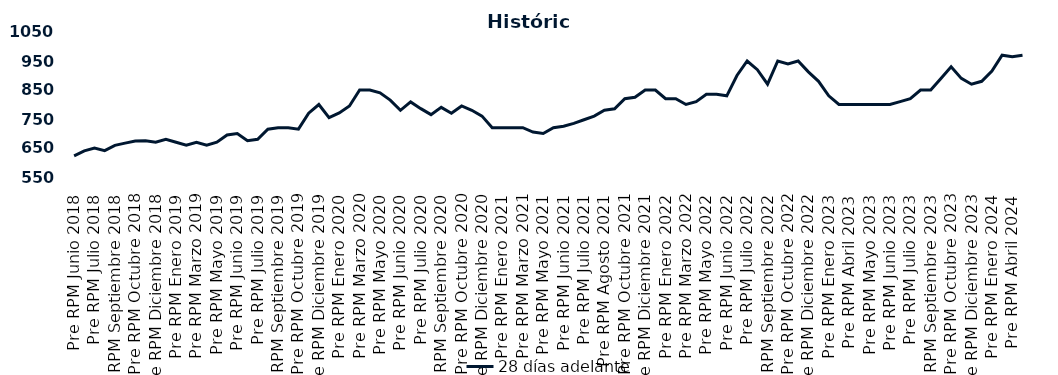
| Category | 28 días adelante |
|---|---|
| Pre RPM Junio 2018 | 623 |
| Post RPM Junio 2018 | 640 |
| Pre RPM Julio 2018 | 650 |
| Post RPM Julio 2018 | 641 |
| Pre RPM Septiembre 2018 | 659 |
| Post RPM Septiembre 2018 | 666.75 |
| Pre RPM Octubre 2018 | 674 |
| Post RPM Octubre 2018 | 675 |
| Pre RPM Diciembre 2018 | 670 |
| Post RPM Diciembre 2018 | 680 |
| Pre RPM Enero 2019 | 670 |
| Post RPM Enero 2019 | 660 |
| Pre RPM Marzo 2019 | 670 |
| Post RPM Marzo 2019 | 660 |
| Pre RPM Mayo 2019 | 670 |
| Post RPM Mayo 2019 | 695 |
| Pre RPM Junio 2019 | 700 |
| Post RPM Junio 2019 | 675 |
| Pre RPM Julio 2019 | 680 |
| Post RPM Julio 2019 | 715 |
| Pre RPM Septiembre 2019 | 720 |
| Post RPM Septiembre 2019 | 720 |
| Pre RPM Octubre 2019 | 715 |
| Post RPM Octubre 2019 | 770 |
| Pre RPM Diciembre 2019 | 800 |
| Post RPM Diciembre 2019 | 755 |
| Pre RPM Enero 2020 | 771 |
| Post RPM Enero 2020 | 795 |
| Pre RPM Marzo 2020 | 850 |
| Post RPM Marzo 2020 | 850 |
| Pre RPM Mayo 2020 | 840 |
| Post RPM Mayo 2020 | 815 |
| Pre RPM Junio 2020 | 780 |
| Post RPM Junio 2020 | 809 |
| Pre RPM Julio 2020 | 785.72 |
| Post RPM Julio 2020 | 765 |
| Pre RPM Septiembre 2020 | 790 |
| Post RPM Septiembre 2020 | 770 |
| Pre RPM Octubre 2020 | 795 |
| Post RPM Octubre 2020 | 780 |
| Pre RPM Diciembre 2020 | 760 |
| Post RPM Diciembre 2020 | 720 |
| Pre RPM Enero 2021 | 720 |
| Post RPM Enero 2021 | 720 |
| Pre RPM Marzo 2021 | 720 |
| Post RPM Marzo 2021 | 705 |
| Pre RPM Mayo 2021 | 700 |
| Post RPM Mayo 2021 | 720 |
| Pre RPM Junio 2021 | 725 |
| Post RPM Junio 2021 | 735 |
| Pre RPM Julio 2021 | 747.5 |
| Post RPM Julio 2021 | 760 |
| Pre RPM Agosto 2021 | 780 |
| Post RPM Agosto 2021 | 785 |
| Pre RPM Octubre 2021 | 820 |
| Post RPM Octubre 2021 | 825 |
| Pre RPM Diciembre 2021 | 850 |
| Post RPM Diciembre 2021 | 850 |
| Pre RPM Enero 2022 | 820 |
| Post RPM Enero 2022 | 820 |
| Pre RPM Marzo 2022 | 800 |
| Post RPM Marzo 2022 | 810 |
| Pre RPM Mayo 2022 | 835 |
| Post RPM Mayo 2022 | 835 |
| Pre RPM Junio 2022 | 830 |
| Post RPM Junio 2022 | 900 |
| Pre RPM Julio 2022 | 950 |
| Post RPM Julio 2022 | 920 |
| Pre RPM Septiembre 2022 | 870 |
| Post RPM Septiembre 2022 | 950 |
| Pre RPM Octubre 2022 | 940 |
| Post RPM Octubre 2022 | 950 |
| Pre RPM Diciembre 2022 | 912.5 |
| Post RPM Diciembre 2022 | 880 |
| Pre RPM Enero 2023 | 830 |
| Post RPM Enero 2023 | 800 |
| Pre RPM Abril 2023 | 800 |
| Post RPM Abril 2023 | 800 |
| Pre RPM Mayo 2023 | 800 |
| Post RPM Mayo 2023 | 800 |
| Pre RPM Junio 2023 | 800 |
| Post RPM Junio 2023 | 810 |
| Pre RPM Julio 2023 | 820 |
| Post RPM Julio 2023 | 850 |
| Pre RPM Septiembre 2023 | 850 |
| Post RPM Septiembre 2023 | 890 |
| Pre RPM Octubre 2023 | 930 |
| Post RPM Octubre 2023 | 890 |
| Pre RPM Diciembre 2023 | 870 |
| Post RPM Diciembre 2023 | 880 |
| Pre RPM Enero 2024 | 915 |
| Post RPM Enero 2024 | 970 |
| Pre RPM Abril 2024 | 965 |
| Post RPM Abril 2024 | 970 |